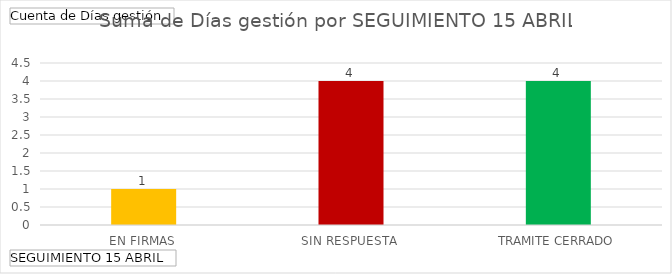
| Category | Total |
|---|---|
| EN FIRMAS | 1 |
| SIN RESPUESTA | 4 |
| TRAMITE CERRADO | 4 |